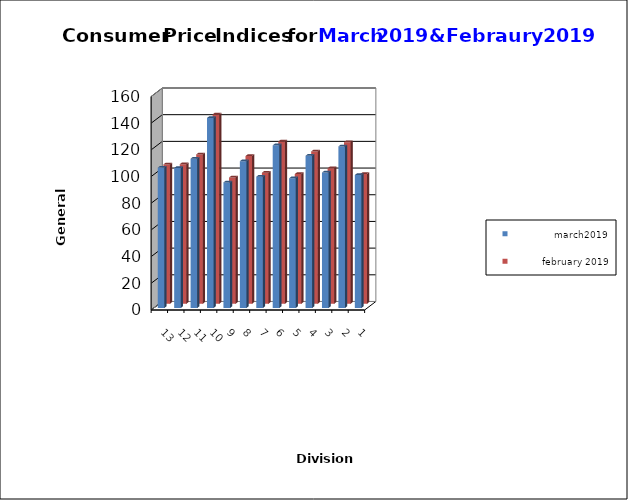
| Category |               march2019 |           february 2019 |
|---|---|---|
| 0 | 99.7 | 97.3 |
| 1 | 121.1 | 121.1 |
| 2 | 101.5 | 101.5 |
| 3 | 114.1 | 114.1 |
| 4 | 97.2 | 97.2 |
| 5 | 121.9 | 121.6 |
| 6 | 98.4 | 98.2 |
| 7 | 110 | 110.7 |
| 8 | 94.1 | 94.6 |
| 9 | 142.4 | 141.9 |
| 10 | 111.9 | 111.9 |
| 11 | 104.9 | 104.6 |
| 12 | 105.2 | 104.4 |